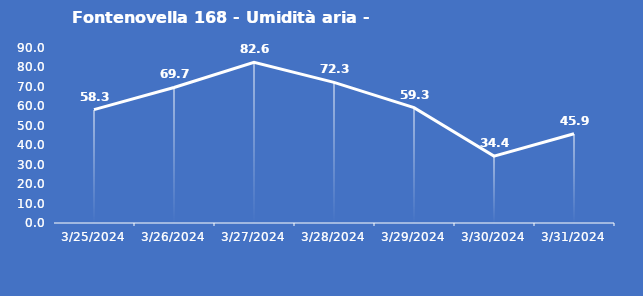
| Category | Fontenovella 168 - Umidità aria - Grezzo (%) |
|---|---|
| 3/25/24 | 58.3 |
| 3/26/24 | 69.7 |
| 3/27/24 | 82.6 |
| 3/28/24 | 72.3 |
| 3/29/24 | 59.3 |
| 3/30/24 | 34.4 |
| 3/31/24 | 45.9 |